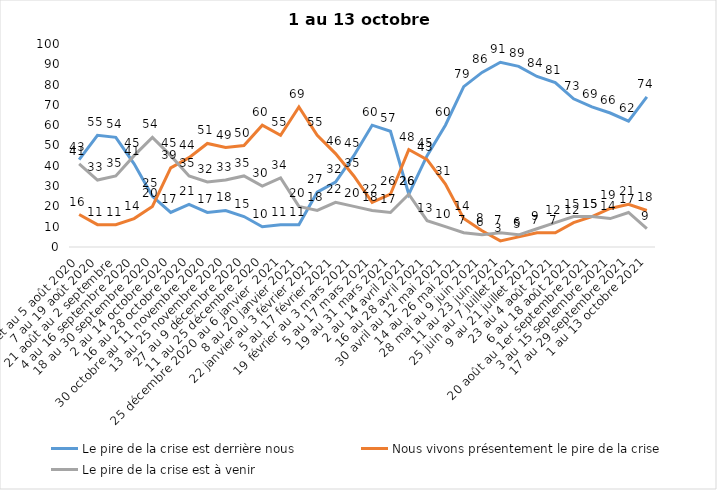
| Category | Le pire de la crise est derrière nous | Nous vivons présentement le pire de la crise | Le pire de la crise est à venir |
|---|---|---|---|
| 24 juillet au 5 août 2020 | 43 | 16 | 41 |
| 7 au 19 août 2020 | 55 | 11 | 33 |
| 21 août au 2 septembre | 54 | 11 | 35 |
| 4 au 16 septembre 2020 | 41 | 14 | 45 |
| 18 au 30 septembre 2020 | 25 | 20 | 54 |
| 2 au 14 octobre 2020 | 17 | 39 | 45 |
| 16 au 28 octobre 2020 | 21 | 44 | 35 |
| 30 octobre au 11 novembre 2020 | 17 | 51 | 32 |
| 13 au 25 novembre 2020 | 18 | 49 | 33 |
| 27 au 9 décembre 2020 | 15 | 50 | 35 |
| 11 au 25 décembre 2020 | 10 | 60 | 30 |
| 25 décembre 2020 au 6 janvier  2021 | 11 | 55 | 34 |
| 8 au 20 janvier 2021 | 11 | 69 | 20 |
| 22 janvier au 3 février 2021 | 27 | 55 | 18 |
| 5 au 17 février 2021 | 32 | 46 | 22 |
| 19 février au 3 mars 2021 | 45 | 35 | 20 |
| 5 au 17 mars 2021 | 60 | 22 | 18 |
| 19 au 31 mars 2021 | 57 | 26 | 17 |
| 2 au 14 avril 2021 | 26 | 48 | 26 |
| 16 au 28 avril 2021 | 45 | 43 | 13 |
| 30 avril au 12 mai 2021 | 60 | 31 | 10 |
| 14 au 26 mai 2021 | 79 | 14 | 7 |
| 28 mai au 9 juin 2021 | 86 | 8 | 6 |
| 11 au 23 juin 2021 | 91 | 3 | 7 |
| 25 juin au 7 juillet 2021 | 89 | 5 | 6 |
| 9 au 21 juillet 2021 | 84 | 7 | 9 |
| 23 au 4 août 2021 | 81 | 7 | 12 |
| 6 au 18 août 2021 | 73 | 12 | 15 |
| 20 août au 1er septembre 2021 | 69 | 15 | 15 |
| 3 au 15 septembre 2021 | 66 | 19 | 14 |
| 17 au 29 septembre 2021 | 62 | 21 | 17 |
| 1 au 13 octobre 2021 | 74 | 18 | 9 |